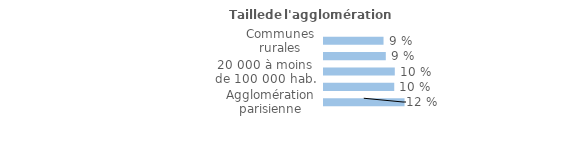
| Category | Series 0 |
|---|---|
| Communes rurales | 0.087 |
| moins de 20 000 hab. | 0.09 |
| 20 000 à moins de 100 000 hab. | 0.103 |
| 100 000 hab. ou plus | 0.102 |
| Agglomération parisienne | 0.117 |